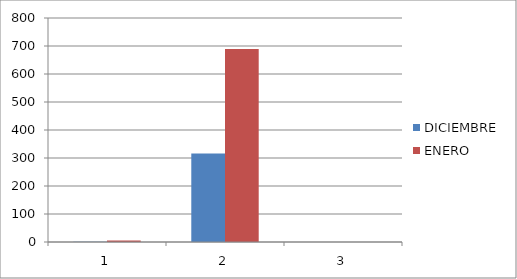
| Category | DICIEMBRE | ENERO |
|---|---|---|
| 0 | 1 | 5 |
| 1 | 316 | 689 |
| 2 | 0 | 0 |